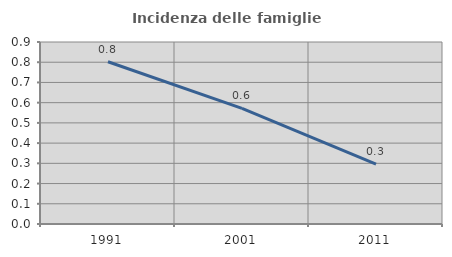
| Category | Incidenza delle famiglie numerose |
|---|---|
| 1991.0 | 0.802 |
| 2001.0 | 0.571 |
| 2011.0 | 0.296 |